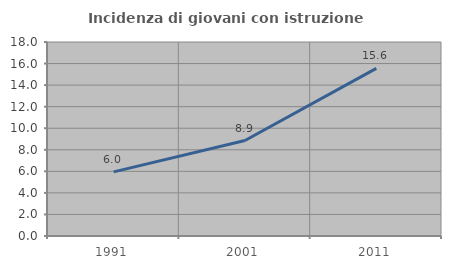
| Category | Incidenza di giovani con istruzione universitaria |
|---|---|
| 1991.0 | 5.952 |
| 2001.0 | 8.861 |
| 2011.0 | 15.556 |